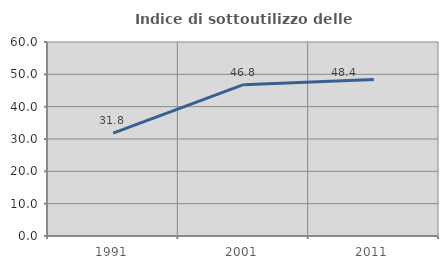
| Category | Indice di sottoutilizzo delle abitazioni  |
|---|---|
| 1991.0 | 31.788 |
| 2001.0 | 46.815 |
| 2011.0 | 48.406 |